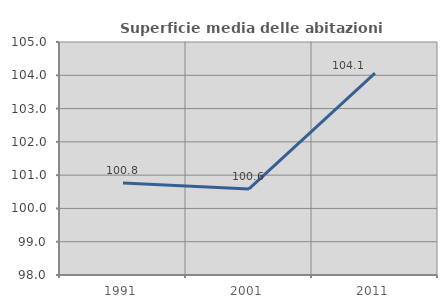
| Category | Superficie media delle abitazioni occupate |
|---|---|
| 1991.0 | 100.767 |
| 2001.0 | 100.586 |
| 2011.0 | 104.067 |